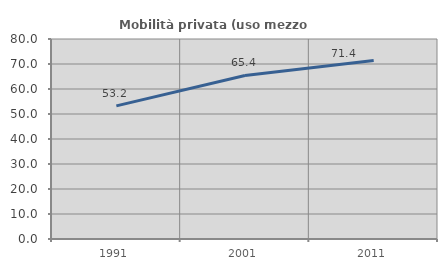
| Category | Mobilità privata (uso mezzo privato) |
|---|---|
| 1991.0 | 53.236 |
| 2001.0 | 65.41 |
| 2011.0 | 71.41 |